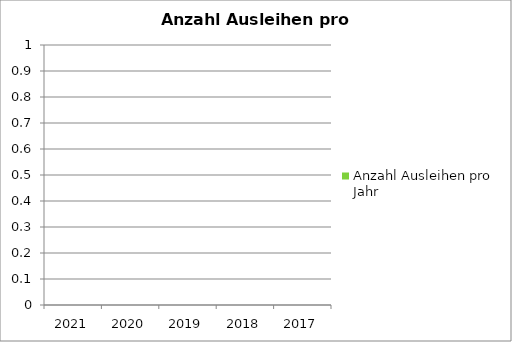
| Category | Anzahl Ausleihen pro Jahr |
|---|---|
| 2021.0 | 0 |
| 2020.0 | 0 |
| 2019.0 | 0 |
| 2018.0 | 0 |
| 2017.0 | 0 |